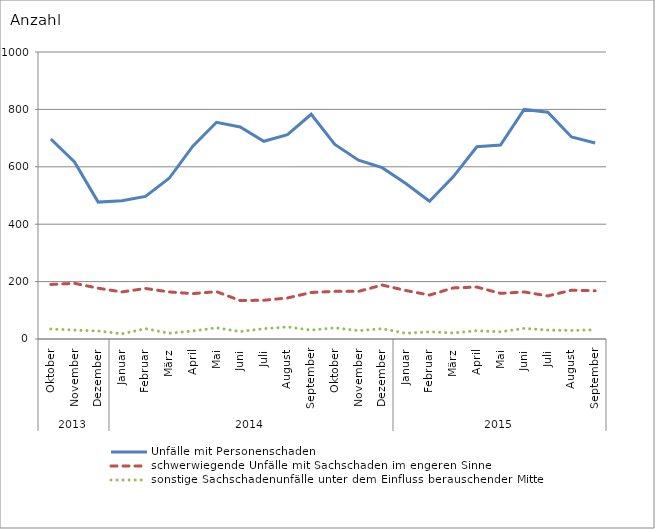
| Category | Unfälle mit Personenschaden | schwerwiegende Unfälle mit Sachschaden im engeren Sinne | sonstige Sachschadenunfälle unter dem Einfluss berauschender Mittel |
|---|---|---|---|
| 0 | 697 | 190 | 35 |
| 1 | 617 | 194 | 31 |
| 2 | 477 | 177 | 28 |
| 3 | 482 | 164 | 18 |
| 4 | 497 | 176 | 36 |
| 5 | 560 | 164 | 20 |
| 6 | 672 | 158 | 28 |
| 7 | 755 | 165 | 39 |
| 8 | 739 | 134 | 26 |
| 9 | 689 | 135 | 36 |
| 10 | 712 | 143 | 42 |
| 11 | 783 | 162 | 31 |
| 12 | 678 | 166 | 39 |
| 13 | 623 | 166 | 29 |
| 14 | 597 | 188 | 36 |
| 15 | 542 | 169 | 20 |
| 16 | 480 | 153 | 25 |
| 17 | 565 | 178 | 21 |
| 18 | 670 | 181 | 29 |
| 19 | 676 | 159 | 25 |
| 20 | 800 | 164 | 37 |
| 21 | 790 | 150 | 31 |
| 22 | 704 | 170 | 30 |
| 23 | 683 | 168 | 32 |